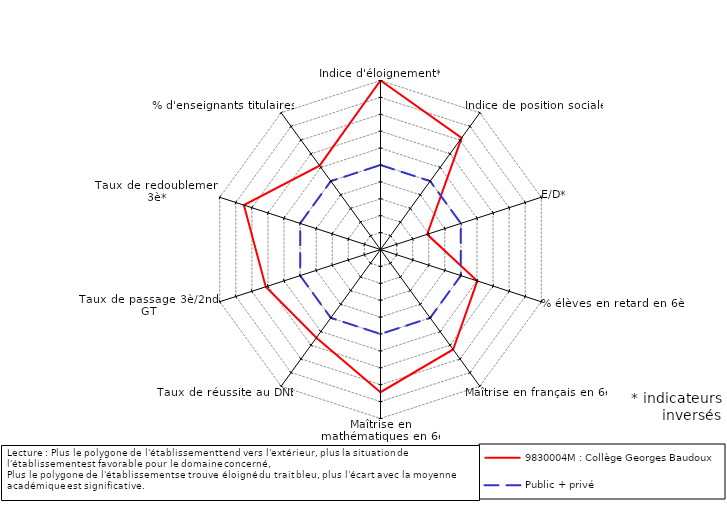
| Category | 9830004M : Collège Georges Baudoux | Public + privé |
|---|---|---|
| Indice d'éloignement* | 5 | 0 |
| Indice de position sociale | 3.165 | 0 |
| E/D* | -2.099 | 0 |
| % élèves en retard en 6è* | 1.022 | 0 |
| Maîtrise en français en 6è | 2.311 | 0 |
| Maîtrise en mathématiques en 6è | 3.444 | 0 |
| Taux de réussite au DNB | 1.456 | 0 |
| Taux de passage 3è/2nde GT | 2.14 | 0 |
| Taux de redoublement 3è* | 3.5 | 0 |
| % d'enseignants titulaires | 1.129 | 0 |